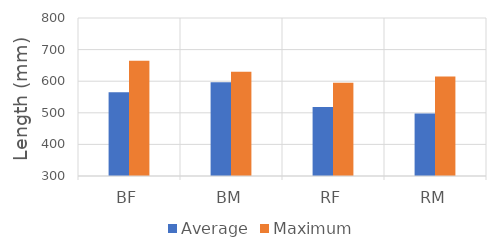
| Category | Average | Maximum |
|---|---|---|
| BF | 565 | 665 |
| BM | 597 | 630 |
| RF | 518 | 595 |
| RM | 498 | 615 |